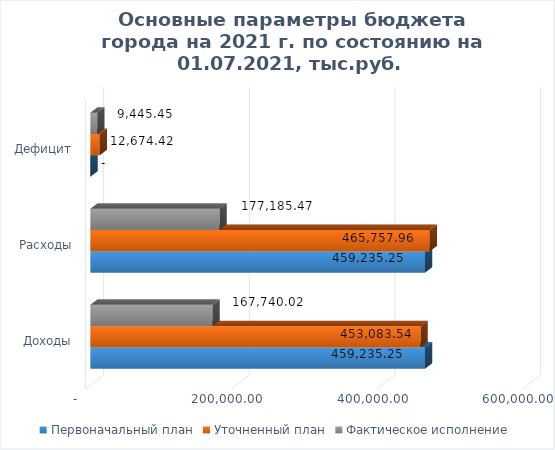
| Category | Первоначальный план | Уточненный план | Фактическое исполнение |
|---|---|---|---|
| Доходы | 459235.253 | 453083.539 | 167740.023 |
| Расходы | 459235.253 | 465757.961 | 177185.47 |
| Дефицит | 0 | 12674.422 | 9445.447 |